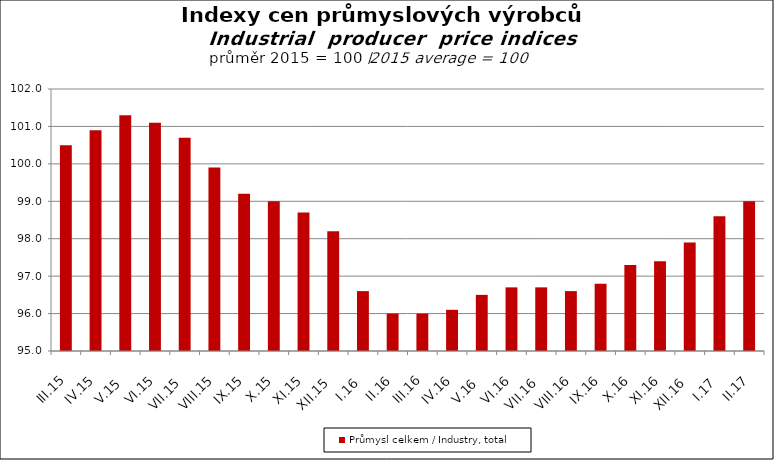
| Category | Průmysl celkem / Industry, total |
|---|---|
| III.15 | 100.5 |
| IV.15 | 100.9 |
| V.15 | 101.3 |
| VI.15 | 101.1 |
| VII.15 | 100.7 |
| VIII.15 | 99.9 |
| IX.15 | 99.2 |
| X.15 | 99 |
| XI.15 | 98.7 |
| XII.15 | 98.2 |
| I.16 | 96.6 |
| II.16 | 96 |
| III.16 | 96 |
| IV.16 | 96.1 |
| V.16 | 96.5 |
| VI.16 | 96.7 |
| VII.16 | 96.7 |
| VIII.16 | 96.6 |
| IX.16 | 96.8 |
| X.16 | 97.3 |
| XI.16 | 97.4 |
| XII.16 | 97.9 |
| I.17 | 98.6 |
| II.17 | 99 |